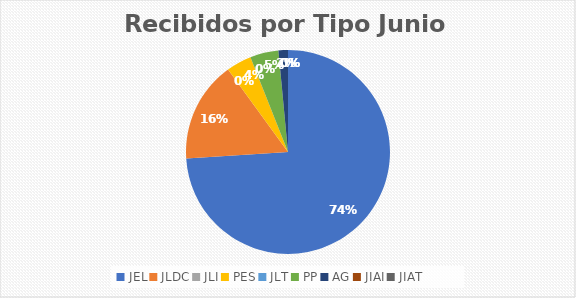
| Category | Series 0 |
|---|---|
| JEL | 148 |
| JLDC | 32 |
| JLI | 0 |
| PES | 8 |
| JLT | 0 |
| PP | 9 |
| AG | 3 |
| JIAI | 0 |
| JIAT | 0 |